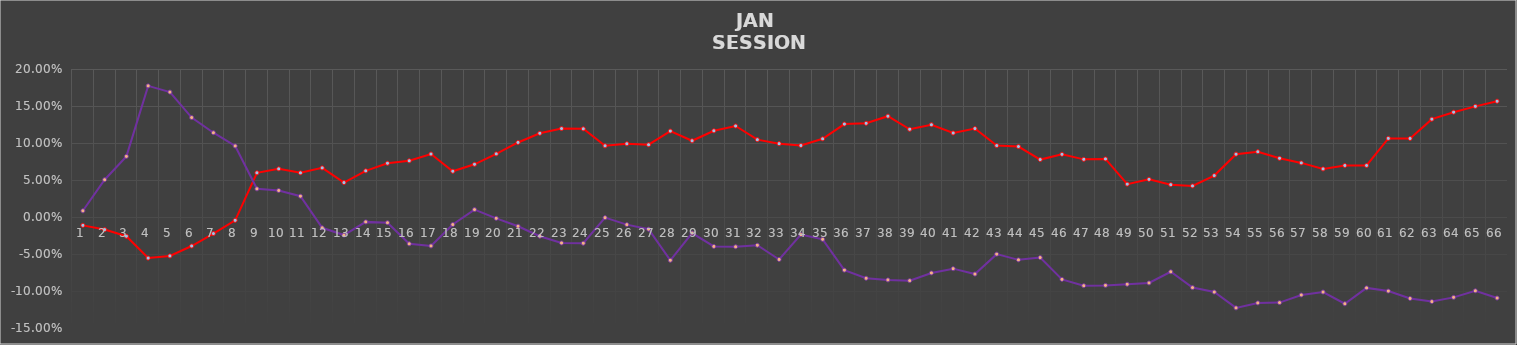
| Category | Series 0 | Series 1 |
|---|---|---|
| 0 | -0.011 | 0.008 |
| 1 | -0.017 | 0.05 |
| 2 | -0.026 | 0.082 |
| 3 | -0.056 | 0.177 |
| 4 | -0.053 | 0.169 |
| 5 | -0.039 | 0.134 |
| 6 | -0.022 | 0.114 |
| 7 | -0.004 | 0.096 |
| 8 | 0.06 | 0.038 |
| 9 | 0.065 | 0.036 |
| 10 | 0.06 | 0.028 |
| 11 | 0.066 | -0.015 |
| 12 | 0.046 | -0.024 |
| 13 | 0.062 | -0.007 |
| 14 | 0.073 | -0.008 |
| 15 | 0.076 | -0.036 |
| 16 | 0.085 | -0.039 |
| 17 | 0.062 | -0.01 |
| 18 | 0.071 | 0.01 |
| 19 | 0.085 | -0.002 |
| 20 | 0.101 | -0.012 |
| 21 | 0.113 | -0.026 |
| 22 | 0.12 | -0.035 |
| 23 | 0.119 | -0.036 |
| 24 | 0.096 | -0.001 |
| 25 | 0.099 | -0.01 |
| 26 | 0.098 | -0.016 |
| 27 | 0.116 | -0.058 |
| 28 | 0.103 | -0.022 |
| 29 | 0.116 | -0.04 |
| 30 | 0.123 | -0.04 |
| 31 | 0.104 | -0.038 |
| 32 | 0.099 | -0.057 |
| 33 | 0.097 | -0.024 |
| 34 | 0.106 | -0.03 |
| 35 | 0.126 | -0.072 |
| 36 | 0.127 | -0.083 |
| 37 | 0.136 | -0.085 |
| 38 | 0.118 | -0.086 |
| 39 | 0.125 | -0.076 |
| 40 | 0.114 | -0.07 |
| 41 | 0.12 | -0.077 |
| 42 | 0.096 | -0.05 |
| 43 | 0.095 | -0.058 |
| 44 | 0.078 | -0.055 |
| 45 | 0.085 | -0.084 |
| 46 | 0.078 | -0.093 |
| 47 | 0.078 | -0.092 |
| 48 | 0.044 | -0.091 |
| 49 | 0.051 | -0.089 |
| 50 | 0.044 | -0.074 |
| 51 | 0.042 | -0.095 |
| 52 | 0.056 | -0.101 |
| 53 | 0.085 | -0.123 |
| 54 | 0.088 | -0.116 |
| 55 | 0.079 | -0.116 |
| 56 | 0.073 | -0.105 |
| 57 | 0.065 | -0.101 |
| 58 | 0.07 | -0.117 |
| 59 | 0.07 | -0.096 |
| 60 | 0.106 | -0.1 |
| 61 | 0.106 | -0.11 |
| 62 | 0.132 | -0.114 |
| 63 | 0.142 | -0.109 |
| 64 | 0.15 | -0.1 |
| 65 | 0.156 | -0.11 |